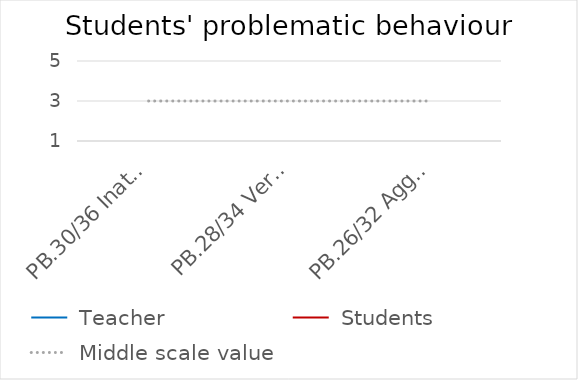
| Category |  Teacher |  Students |  Middle scale value |
|---|---|---|---|
| PB.30/36 Inattentiveness | 0 | 0 | 3 |
| PB.28/34 Verbally disruptive behaviour | 0 | 0 | 3 |
| PB.26/32 Aggression | 0 | 0 | 3 |